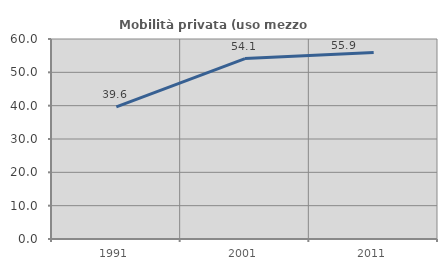
| Category | Mobilità privata (uso mezzo privato) |
|---|---|
| 1991.0 | 39.643 |
| 2001.0 | 54.137 |
| 2011.0 | 55.935 |